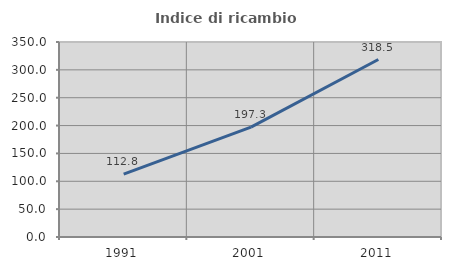
| Category | Indice di ricambio occupazionale  |
|---|---|
| 1991.0 | 112.752 |
| 2001.0 | 197.333 |
| 2011.0 | 318.519 |